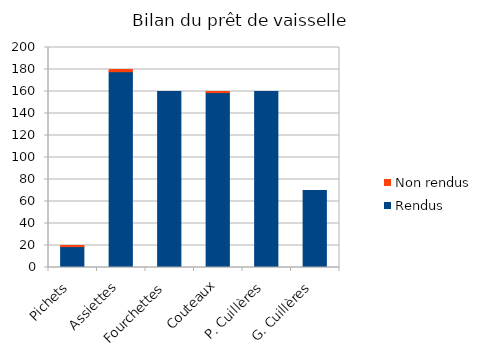
| Category | Rendus | Non rendus |
|---|---|---|
| Pichets | 19 | 1 |
| Assiettes | 178 | 2 |
| Fourchettes | 160 | 0 |
| Couteaux | 159 | 1 |
| P. Cuillères | 160 | 0 |
| G. Cuillères | 70 | 0 |